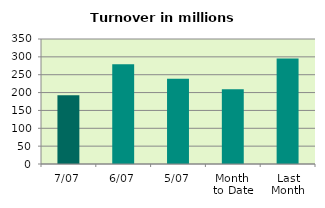
| Category | Series 0 |
|---|---|
| 7/07 | 192.26 |
| 6/07 | 279.111 |
| 5/07 | 238.447 |
| Month 
to Date | 209.186 |
| Last
Month | 295.453 |